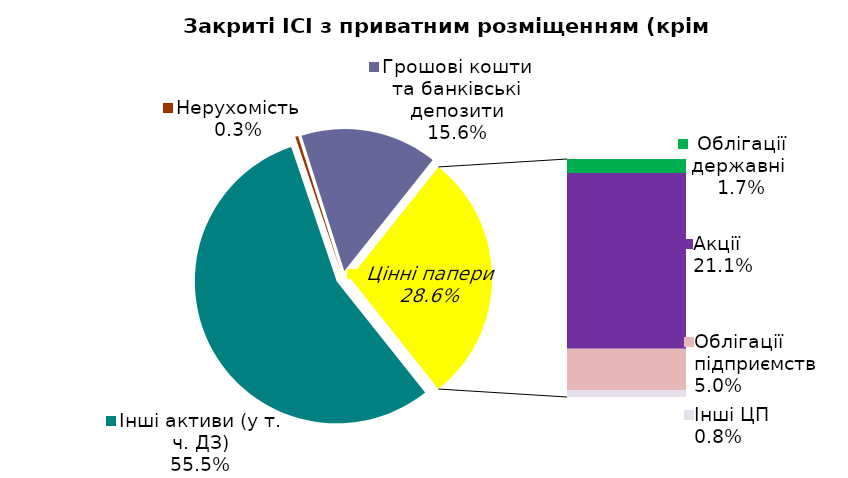
| Category | Series 0 |
|---|---|
| Інші активи (у т. ч. ДЗ) | 0.555 |
| Нерухомість | 0.003 |
| Грошові кошти та банківські депозити | 0.156 |
| Облігації державні  | 0.017 |
| Акцiї | 0.211 |
| Облігації підприємств | 0.05 |
| Інші ЦП | 0.008 |